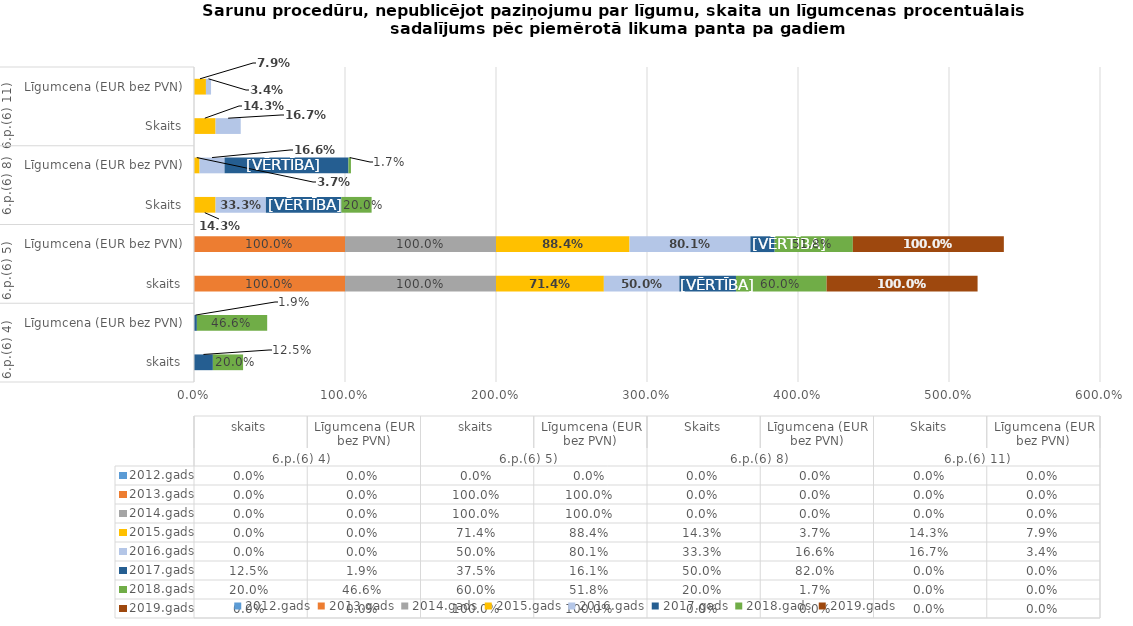
| Category | 2012.gads | 2013.gads | 2014.gads | 2015.gads | 2016.gads | 2017.gads | 2018.gads | 2019.gads |
|---|---|---|---|---|---|---|---|---|
| 0 | 0 | 0 | 0 | 0 | 0 | 0.125 | 0.2 | 0 |
| 1 | 0 | 0 | 0 | 0 | 0 | 0.019 | 0.466 | 0 |
| 2 | 0 | 1 | 1 | 0.714 | 0.5 | 0.375 | 0.6 | 1 |
| 3 | 0 | 1 | 1 | 0.884 | 0.801 | 0.161 | 0.518 | 1 |
| 4 | 0 | 0 | 0 | 0.143 | 0.333 | 0.5 | 0.2 | 0 |
| 5 | 0 | 0 | 0 | 0.037 | 0.166 | 0.82 | 0.017 | 0 |
| 6 | 0 | 0 | 0 | 0.143 | 0.167 | 0 | 0 | 0 |
| 7 | 0 | 0 | 0 | 0.079 | 0.034 | 0 | 0 | 0 |